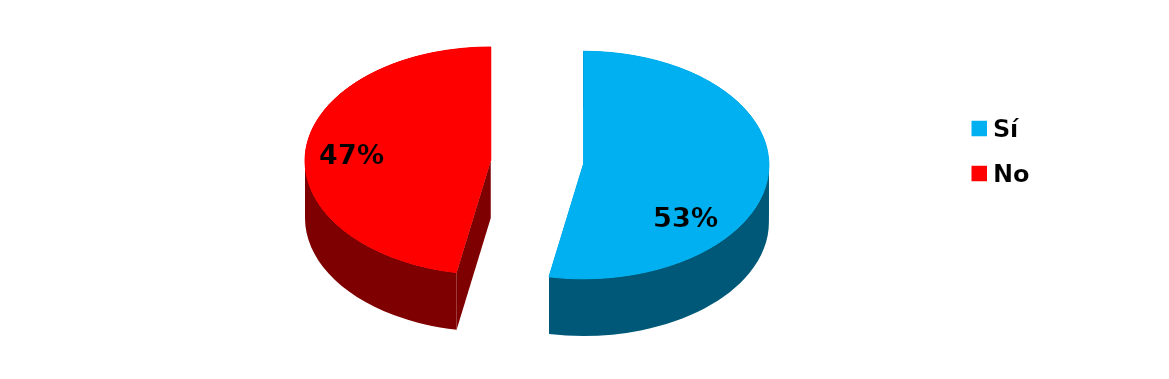
| Category | Series 0 |
|---|---|
| Sí | 9 |
| No | 8 |